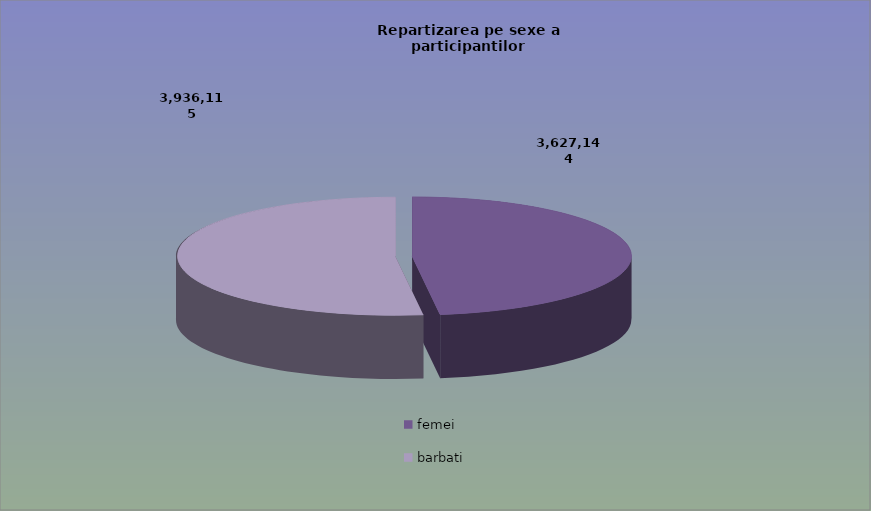
| Category | Series 0 |
|---|---|
| femei | 3627144 |
| barbati | 3936115 |